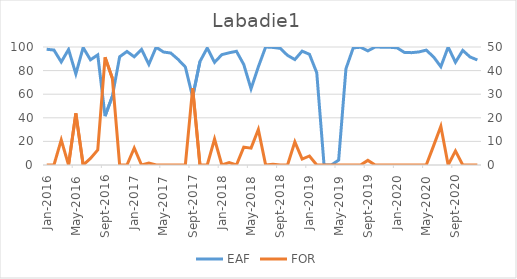
| Category | EAF |
|---|---|
| 2016-01-01 | 98.07 |
| 2016-02-01 | 97.42 |
| 2016-03-01 | 87.33 |
| 2016-04-01 | 97.89 |
| 2016-05-01 | 77.2 |
| 2016-06-01 | 99.52 |
| 2016-07-01 | 89.13 |
| 2016-08-01 | 93.32 |
| 2016-09-01 | 41.41 |
| 2016-10-01 | 58.2 |
| 2016-11-01 | 91.71 |
| 2016-12-01 | 96.21 |
| 2017-01-01 | 91.68 |
| 2017-02-01 | 97.96 |
| 2017-03-01 | 85.27 |
| 2017-04-01 | 99.84 |
| 2017-05-01 | 95.74 |
| 2017-06-01 | 94.89 |
| 2017-07-01 | 89.52 |
| 2017-08-01 | 83.06 |
| 2017-09-01 | 57.62 |
| 2017-10-01 | 87.7 |
| 2017-11-01 | 99.15 |
| 2017-12-01 | 87 |
| 2018-01-01 | 93.53 |
| 2018-02-01 | 95.09 |
| 2018-03-01 | 96.37 |
| 2018-04-01 | 85.19 |
| 2018-05-01 | 64.56 |
| 2018-06-01 | 83.21 |
| 2018-07-01 | 100 |
| 2018-08-01 | 99.65 |
| 2018-09-01 | 98.85 |
| 2018-10-01 | 92.9 |
| 2018-11-01 | 89.37 |
| 2018-12-01 | 96.5 |
| 2019-01-01 | 93.8 |
| 2019-02-01 | 78.23 |
| 2019-03-01 | 0 |
| 2019-04-01 | 0 |
| 2019-05-01 | 4.14 |
| 2019-06-01 | 81.6 |
| 2019-07-01 | 99.26 |
| 2019-08-01 | 99.81 |
| 2019-09-01 | 96.73 |
| 2019-10-01 | 100 |
| 2019-11-01 | 99.83 |
| 2019-12-01 | 99.76 |
| 2020-01-01 | 99.29 |
| 2020-02-01 | 95.44 |
| 2020-03-01 | 95.2 |
| 2020-04-01 | 95.82 |
| 2020-05-01 | 97.36 |
| 2020-06-01 | 91.59 |
| 2020-07-01 | 83.32 |
| 2020-08-01 | 100 |
| 2020-09-01 | 87.07 |
| 2020-10-01 | 97.12 |
| 2020-11-01 | 91.57 |
| 2020-12-01 | 89.01 |